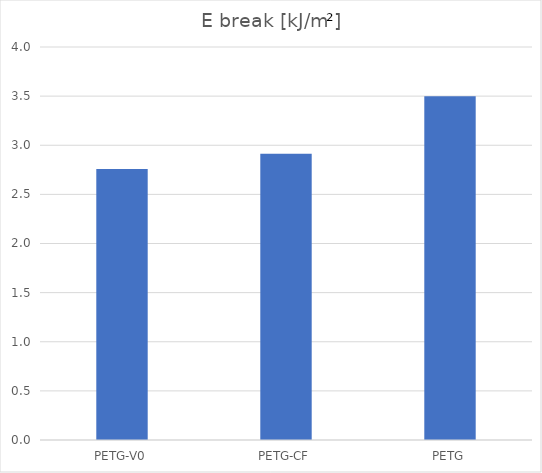
| Category | kJ/m² |
|---|---|
| PETG-V0 | 2.759 |
| PETG-CF | 2.912 |
| PETG | 3.5 |